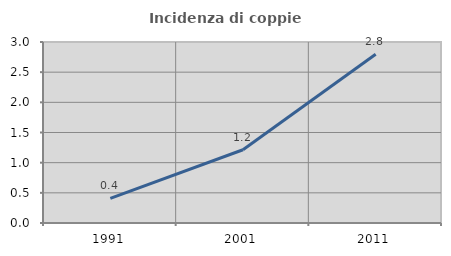
| Category | Incidenza di coppie miste |
|---|---|
| 1991.0 | 0.408 |
| 2001.0 | 1.214 |
| 2011.0 | 2.796 |